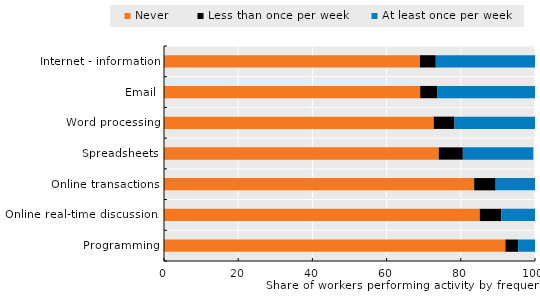
| Category | Never | Less than once per week | At least once per week |
|---|---|---|---|
| Programming | 92.021 | 3.429 | 4.55 |
| Online real-time discussions | 85.109 | 5.811 | 9.08 |
| Online transactions | 83.601 | 5.795 | 10.604 |
| Spreadsheets | 74.063 | 6.487 | 18.996 |
| Word processing | 72.699 | 5.592 | 21.709 |
| Email | 69.054 | 4.553 | 26.393 |
| Internet - information | 68.991 | 4.269 | 26.739 |